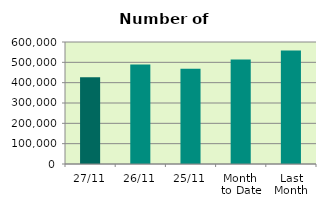
| Category | Series 0 |
|---|---|
| 27/11 | 426804 |
| 26/11 | 489372 |
| 25/11 | 468444 |
| Month 
to Date | 513716.947 |
| Last
Month | 558199.478 |